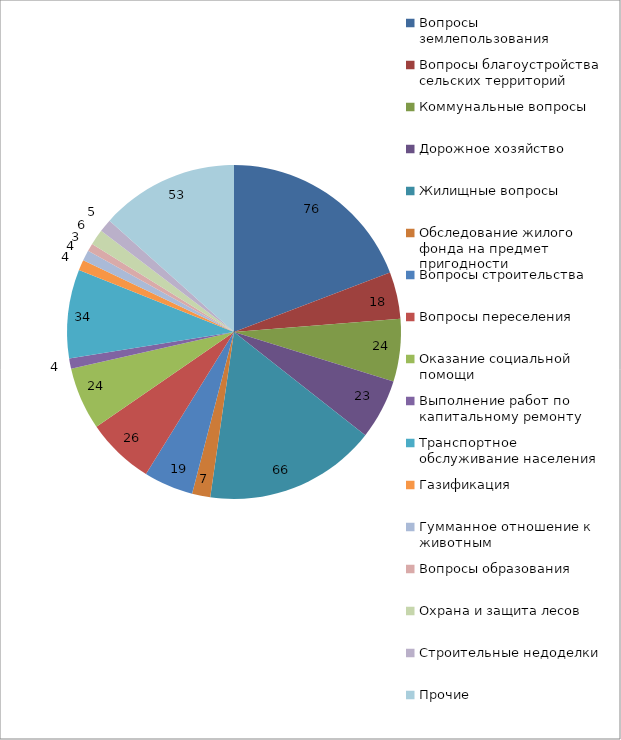
| Category | Series 0 |
|---|---|
| Вопросы землепользования | 76 |
| Вопросы благоустройства сельских территорий | 18 |
| Коммунальные вопросы | 24 |
| Дорожное хозяйство | 23 |
| Жилищные вопросы | 66 |
| Обследование жилого фонда на предмет пригодности | 7 |
| Вопросы строительства | 19 |
| Вопросы переселения | 26 |
| Оказание социальной помощи | 24 |
| Выполнение работ по капитальному ремонту | 4 |
| Транспортное обслуживание населения | 34 |
| Газификация | 4 |
| Гумманное отношение к животным | 4 |
| Вопросы образования | 3 |
| Охрана и защита лесов | 6 |
| Строительные недоделки | 5 |
| Прочие | 53 |